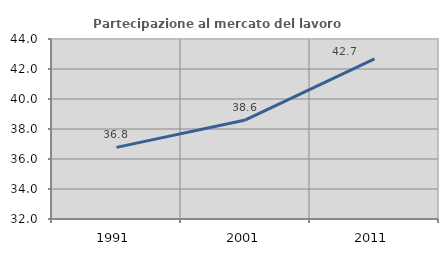
| Category | Partecipazione al mercato del lavoro  femminile |
|---|---|
| 1991.0 | 36.775 |
| 2001.0 | 38.604 |
| 2011.0 | 42.678 |